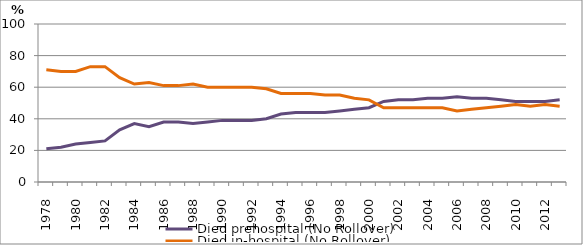
| Category | Died prehospital (No Rollover) | Died in-hospital (No Rollover) |
|---|---|---|
| 1978.0 | 21 | 71 |
| 1979.0 | 22 | 70 |
| 1980.0 | 24 | 70 |
| 1981.0 | 25 | 73 |
| 1982.0 | 26 | 73 |
| 1983.0 | 33 | 66 |
| 1984.0 | 37 | 62 |
| 1985.0 | 35 | 63 |
| 1986.0 | 38 | 61 |
| 1987.0 | 38 | 61 |
| 1988.0 | 37 | 62 |
| 1989.0 | 38 | 60 |
| 1990.0 | 39 | 60 |
| 1991.0 | 39 | 60 |
| 1992.0 | 39 | 60 |
| 1993.0 | 40 | 59 |
| 1994.0 | 43 | 56 |
| 1995.0 | 44 | 56 |
| 1996.0 | 44 | 56 |
| 1997.0 | 44 | 55 |
| 1998.0 | 45 | 55 |
| 1999.0 | 46 | 53 |
| 2000.0 | 47 | 52 |
| 2001.0 | 51 | 47 |
| 2002.0 | 52 | 47 |
| 2003.0 | 52 | 47 |
| 2004.0 | 53 | 47 |
| 2005.0 | 53 | 47 |
| 2006.0 | 54 | 45 |
| 2007.0 | 53 | 46 |
| 2008.0 | 53 | 47 |
| 2009.0 | 52 | 48 |
| 2010.0 | 51 | 49 |
| 2011.0 | 51 | 48 |
| 2012.0 | 51 | 49 |
| 2013.0 | 52 | 48 |